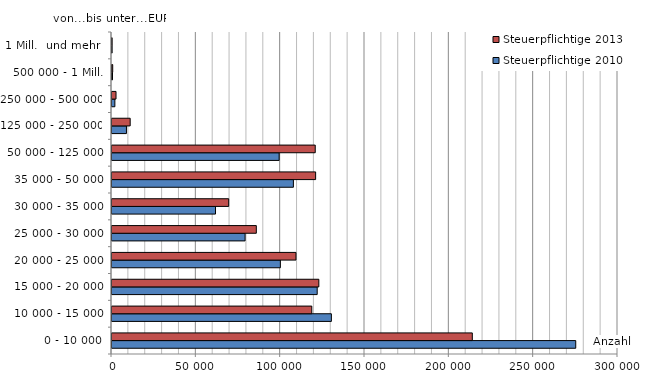
| Category | Steuerpflichtige 2010 | Steuerpflichtige 2013 |
|---|---|---|
| 0 - 10 000 | 274943 | 213633 |
| 10 000 - 15 000 | 130065 | 118452 |
| 15 000 - 20 000 | 121660 | 122629 |
| 20 000 - 25 000 | 99823 | 109080 |
| 25 000 - 30 000 | 78902 | 85568 |
| 30 000 - 35 000 | 61372 | 69183 |
| 35 000 - 50 000 | 107549 | 120730 |
| 50 000 - 125 000 | 99088 | 120496 |
| 125 000 - 250 000 | 8562 | 10782 |
| 250 000 - 500 000 | 1696 | 2383 |
| 500 000 - 1 Mill. | 303 | 421 |
| 1 Mill.  und mehr  | 70 | 78 |